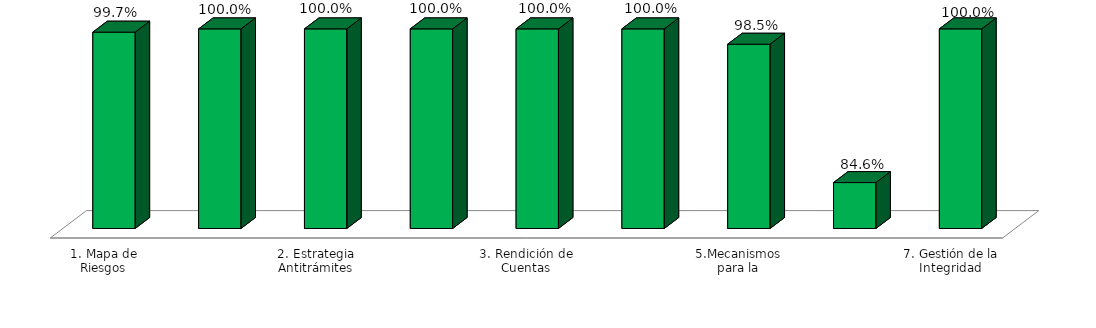
| Category | Series 0 |
|---|---|
| 1. Mapa de Riesgos | 0.997 |
| 1.1 Estrategia de la Administración del Riesgo | 1 |
| 2. Estrategia Antitrámites | 1 |
| 2.1 Estrategia de Racionalización de trámites | 1 |
| 3. Rendición de Cuentas | 1 |
| 4. Mecanismos para Mejorar la Atención al Ciudadano | 1 |
| 5.Mecanismos para la Transparencia y el Acceso a la Información | 0.985 |
| 6. Iniciativas Adicionales | 0.846 |
| 7. Gestión de la Integridad | 1 |